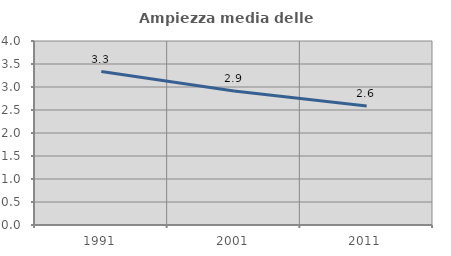
| Category | Ampiezza media delle famiglie |
|---|---|
| 1991.0 | 3.336 |
| 2001.0 | 2.914 |
| 2011.0 | 2.587 |